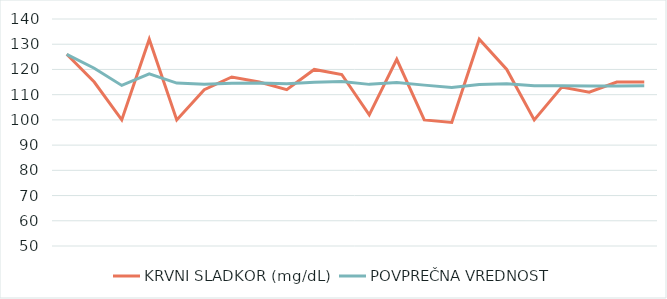
| Category | KRVNI SLADKOR (mg/dL) | POVPREČNA VREDNOST |
|---|---|---|
| 0 | 126 | 126 |
| 1 | 115 | 120.5 |
| 2 | 100 | 113.667 |
| 3 | 132 | 118.25 |
| 4 | 100 | 114.6 |
| 5 | 112 | 114.167 |
| 6 | 117 | 114.571 |
| 7 | 115 | 114.625 |
| 8 | 112 | 114.333 |
| 9 | 120 | 114.9 |
| 10 | 118 | 115.182 |
| 11 | 102 | 114.083 |
| 12 | 124 | 114.846 |
| 13 | 100 | 113.786 |
| 14 | 99 | 112.8 |
| 15 | 132 | 114 |
| 16 | 120 | 114.353 |
| 17 | 100 | 113.556 |
| 18 | 113 | 113.526 |
| 19 | 111 | 113.4 |
| 20 | 115 | 113.476 |
| 21 | 115 | 113.545 |